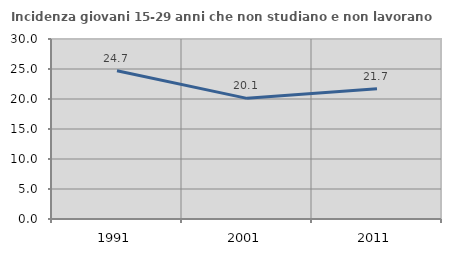
| Category | Incidenza giovani 15-29 anni che non studiano e non lavorano  |
|---|---|
| 1991.0 | 24.719 |
| 2001.0 | 20.109 |
| 2011.0 | 21.713 |